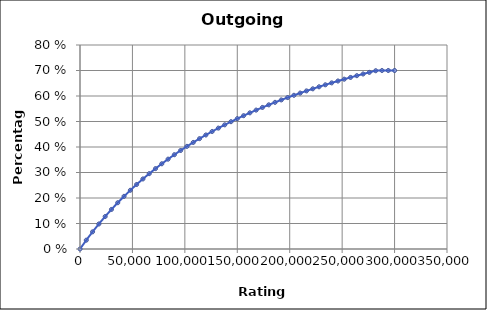
| Category | Outgoing Healing |
|---|---|
| 0.0 | 0 |
| 6000.0 | 0.035 |
| 12000.0 | 0.067 |
| 18000.0 | 0.098 |
| 24000.0 | 0.127 |
| 30000.0 | 0.155 |
| 36000.0 | 0.181 |
| 42000.0 | 0.206 |
| 48000.0 | 0.23 |
| 54000.0 | 0.253 |
| 60000.0 | 0.275 |
| 66000.0 | 0.295 |
| 72000.0 | 0.315 |
| 78000.0 | 0.334 |
| 84000.0 | 0.352 |
| 90000.0 | 0.37 |
| 96000.0 | 0.386 |
| 102000.0 | 0.402 |
| 108000.0 | 0.418 |
| 114000.0 | 0.433 |
| 120000.0 | 0.447 |
| 126000.0 | 0.461 |
| 132000.0 | 0.474 |
| 138000.0 | 0.487 |
| 144000.0 | 0.499 |
| 150000.0 | 0.511 |
| 156000.0 | 0.523 |
| 162000.0 | 0.534 |
| 168000.0 | 0.545 |
| 174000.0 | 0.555 |
| 180000.0 | 0.565 |
| 186000.0 | 0.575 |
| 192000.0 | 0.585 |
| 198000.0 | 0.594 |
| 204000.0 | 0.603 |
| 210000.0 | 0.612 |
| 216000.0 | 0.62 |
| 222000.0 | 0.628 |
| 228000.0 | 0.636 |
| 234000.0 | 0.644 |
| 240000.0 | 0.651 |
| 246000.0 | 0.659 |
| 252000.0 | 0.666 |
| 258000.0 | 0.673 |
| 264000.0 | 0.68 |
| 270000.0 | 0.686 |
| 276000.0 | 0.693 |
| 282000.0 | 0.699 |
| 288000.0 | 0.7 |
| 294000.0 | 0.7 |
| 300000.0 | 0.7 |